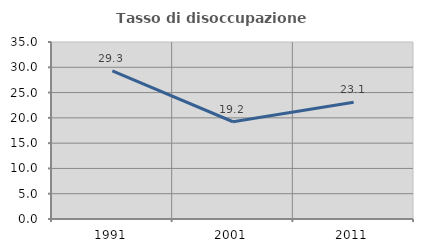
| Category | Tasso di disoccupazione giovanile  |
|---|---|
| 1991.0 | 29.268 |
| 2001.0 | 19.231 |
| 2011.0 | 23.077 |